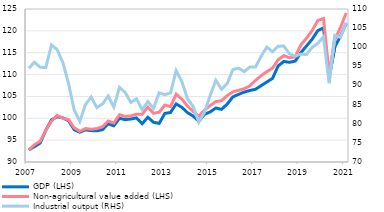
| Category | GDP (LHS) | Non-agricultural value added (LHS) |
|---|---|---|
| 2007 | 92.769 | 92.764 |
| II | 93.531 | 93.958 |
| III | 94.327 | 94.738 |
| IV | 97.287 | 97.285 |
| 2008 | 99.637 | 99.347 |
| II | 100.363 | 100.653 |
| III | 100.09 | 100.02 |
| IV | 99.463 | 99.693 |
| 2009 | 97.39 | 97.82 |
| II | 96.81 | 97.017 |
| III | 97.364 | 97.657 |
| IV | 97.185 | 97.494 |
| 2010 | 97.141 | 97.629 |
| II | 97.393 | 98.081 |
| III | 98.725 | 99.386 |
| IV | 98.282 | 98.908 |
| 2011 | 100.008 | 100.814 |
| II | 99.679 | 100.421 |
| III | 99.834 | 100.537 |
| IV | 100.094 | 100.949 |
| 2012 | 98.756 | 100.943 |
| II | 100.237 | 102.542 |
| III | 99.086 | 101.133 |
| IV | 98.834 | 101.399 |
| 2013 | 101.117 | 103.027 |
| II | 101.317 | 102.659 |
| III | 103.295 | 105.518 |
| IV | 102.503 | 104.383 |
| 2014 | 101.299 | 102.779 |
| II | 100.5 | 101.573 |
| III | 99.315 | 100.481 |
| IV | 100.909 | 101.869 |
| 2015 | 101.462 | 102.896 |
| II | 102.35 | 103.826 |
| III | 102.041 | 104.008 |
| IV | 103.242 | 105.19 |
| 2016 | 104.89 | 106.043 |
| II | 105.459 | 106.394 |
| III | 105.992 | 106.773 |
| IV | 106.361 | 107.414 |
| 2017 | 106.639 | 108.665 |
| II | 107.466 | 109.749 |
| III | 108.304 | 110.663 |
| IV | 109.117 | 111.465 |
| 2018 | 111.986 | 113.4 |
| II | 113.006 | 114.32 |
| III | 112.805 | 113.851 |
| IV | 113.077 | 114.044 |
| 2019 | 115.016 | 116.792 |
| II | 116.535 | 118.302 |
| III | 118.097 | 120.099 |
| IV | 120.063 | 122.351 |
| 2020 | 120.675 | 122.82 |
| II | 109.422 | 110.178 |
| III | 116.35 | 117.985 |
| IV | 118.776 | 120.807 |
| 2021 | 121.687 | 124.078 |